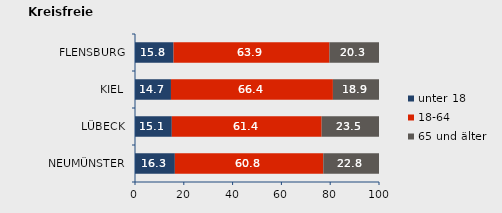
| Category | unter 18 | 18-64 | 65 und älter |
|---|---|---|---|
| NEUMÜNSTER | 16.332 | 60.845 | 22.823 |
| LÜBECK | 15.085 | 61.405 | 23.51 |
| KIEL | 14.739 | 66.37 | 18.891 |
| FLENSBURG | 15.807 | 63.876 | 20.317 |